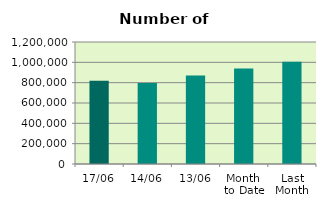
| Category | Series 0 |
|---|---|
| 17/06 | 818576 |
| 14/06 | 796694 |
| 13/06 | 871382 |
| Month 
to Date | 939765.636 |
| Last
Month | 1004730.273 |